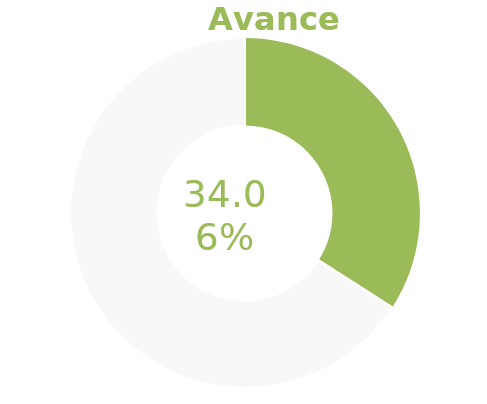
| Category | Series 0 |
|---|---|
| Acumulado 1 Trimestre | 0.341 |
| Año | -0.659 |